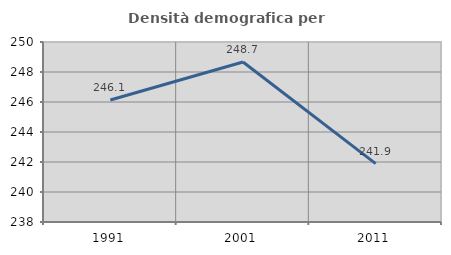
| Category | Densità demografica |
|---|---|
| 1991.0 | 246.135 |
| 2001.0 | 248.664 |
| 2011.0 | 241.892 |